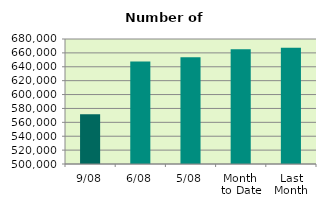
| Category | Series 0 |
|---|---|
| 9/08 | 571748 |
| 6/08 | 647458 |
| 5/08 | 653794 |
| Month 
to Date | 665188.333 |
| Last
Month | 667427.091 |